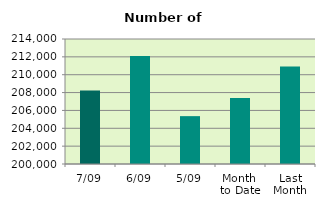
| Category | Series 0 |
|---|---|
| 7/09 | 208236 |
| 6/09 | 212092 |
| 5/09 | 205360 |
| Month 
to Date | 207382 |
| Last
Month | 210930.348 |